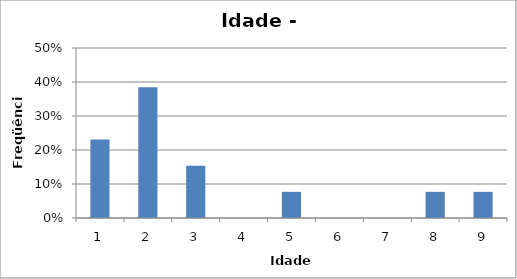
| Category | Series 0 |
|---|---|
| 0 | 0.231 |
| 1 | 0.385 |
| 2 | 0.154 |
| 3 | 0 |
| 4 | 0.077 |
| 5 | 0 |
| 6 | 0 |
| 7 | 0.077 |
| 8 | 0.077 |